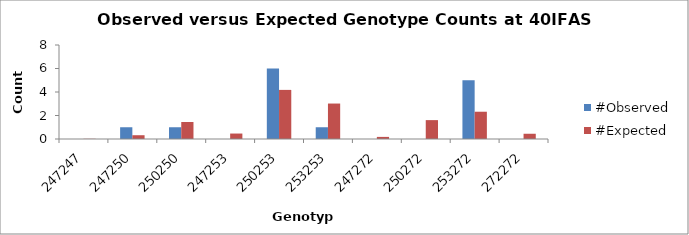
| Category | #Observed | #Expected |
|---|---|---|
| 247247.0 | 0 | 0.018 |
| 247250.0 | 1 | 0.321 |
| 250250.0 | 1 | 1.446 |
| 247253.0 | 0 | 0.464 |
| 250253.0 | 6 | 4.179 |
| 253253.0 | 1 | 3.018 |
| 247272.0 | 0 | 0.179 |
| 250272.0 | 0 | 1.607 |
| 253272.0 | 5 | 2.321 |
| 272272.0 | 0 | 0.446 |